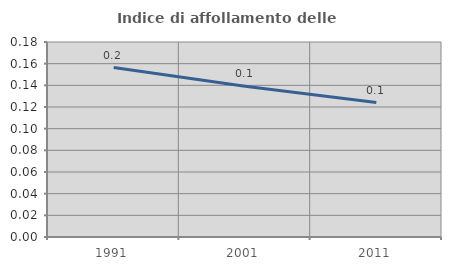
| Category | Indice di affollamento delle abitazioni  |
|---|---|
| 1991.0 | 0.156 |
| 2001.0 | 0.139 |
| 2011.0 | 0.124 |